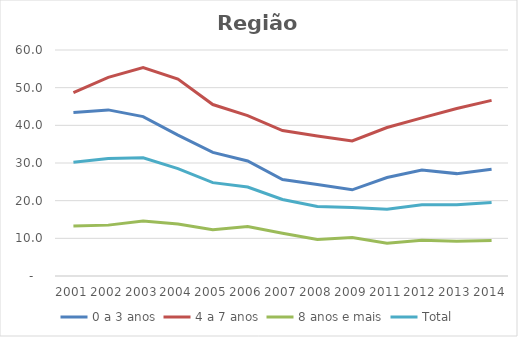
| Category | 0 a 3 anos | 4 a 7 anos | 8 anos e mais | Total |
|---|---|---|---|---|
| 2001.0 | 43.399 | 48.68 | 13.258 | 30.224 |
| 2002.0 | 44.1 | 52.748 | 13.506 | 31.165 |
| 2003.0 | 42.327 | 55.309 | 14.607 | 31.396 |
| 2004.0 | 37.39 | 52.291 | 13.789 | 28.521 |
| 2005.0 | 32.804 | 45.523 | 12.3 | 24.789 |
| 2006.0 | 30.528 | 42.564 | 13.111 | 23.607 |
| 2007.0 | 25.613 | 38.602 | 11.35 | 20.312 |
| 2008.0 | 24.316 | 37.156 | 9.693 | 18.468 |
| 2009.0 | 22.881 | 35.853 | 10.249 | 18.159 |
| 2011.0 | 26.143 | 39.417 | 8.716 | 17.752 |
| 2012.0 | 28.145 | 41.976 | 9.489 | 18.943 |
| 2013.0 | 27.181 | 44.47 | 9.249 | 18.894 |
| 2014.0 | 28.33 | 46.616 | 9.4 | 19.533 |